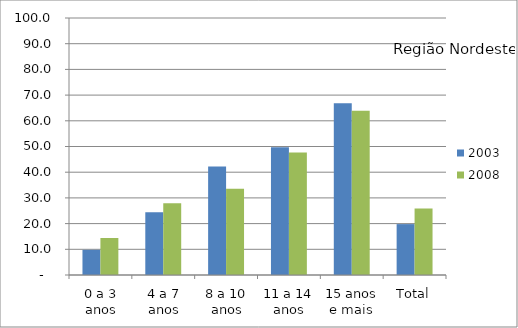
| Category | 2003 | 2008 |
|---|---|---|
| 0 a 3 anos | 9.8 | 14.4 |
| 4 a 7 anos | 24.4 | 27.9 |
| 8 a 10 anos | 42.2 | 33.6 |
| 11 a 14 anos | 49.7 | 47.7 |
| 15 anos e mais | 66.8 | 63.9 |
| Total | 19.8 | 25.9 |